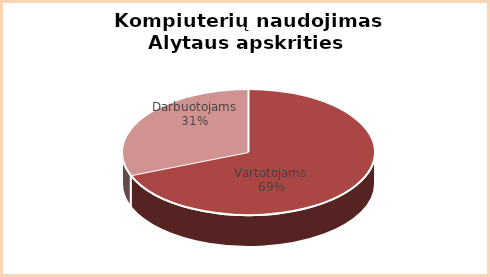
| Category | Series 0 |
|---|---|
| Vartotojams | 0.69 |
| Darbuotojams | 0.31 |